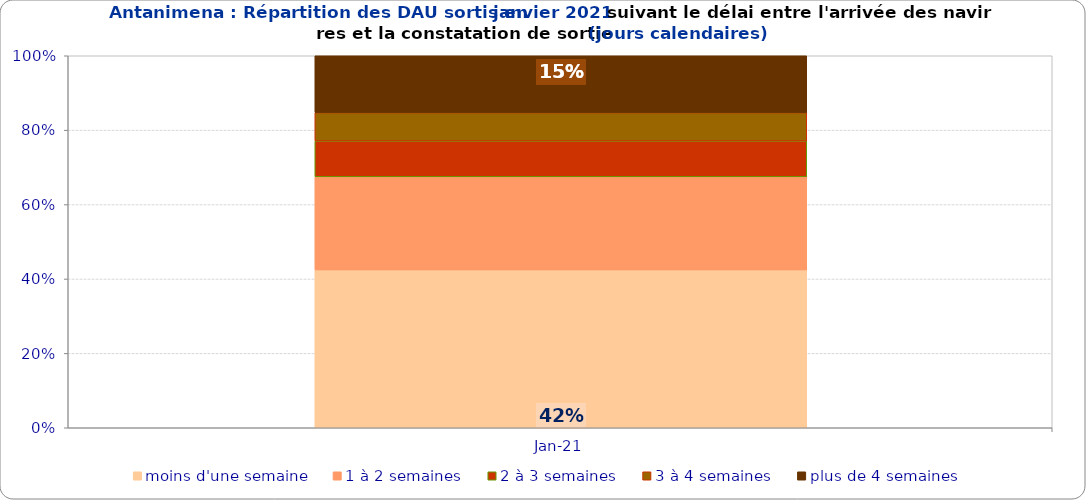
| Category | moins d'une semaine | 1 à 2 semaines | 2 à 3 semaines | 3 à 4 semaines | plus de 4 semaines |
|---|---|---|---|---|---|
| 2021-01-01 | 0.424 | 0.25 | 0.096 | 0.076 | 0.153 |